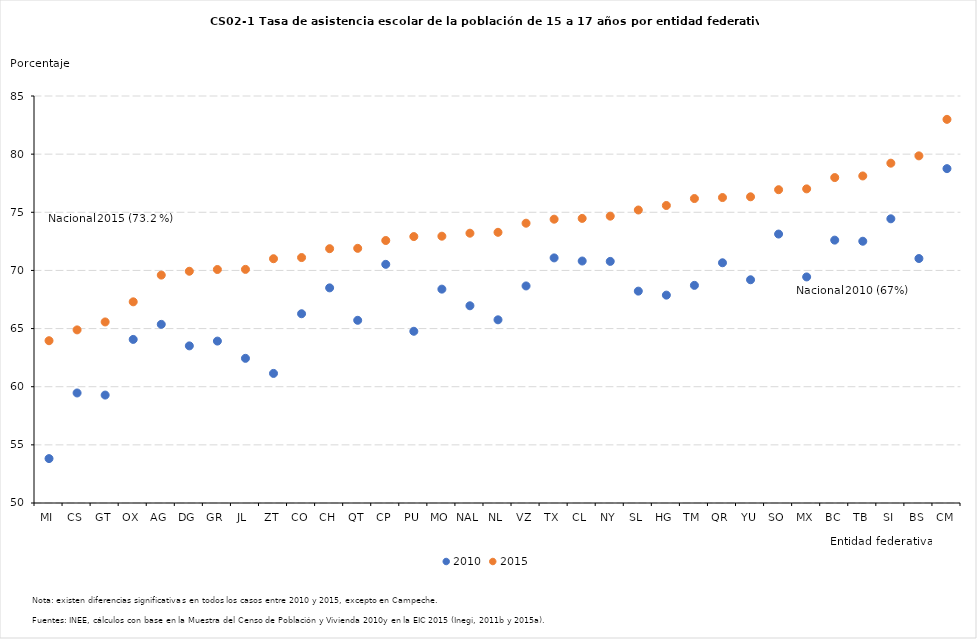
| Category | 2010 | 2015 | nal 2010 | nal 2015 |
|---|---|---|---|---|
| MI | 53.818 | 63.955 | 66.959 | 73.202 |
| CS | 59.462 | 64.887 | 66.959 | 73.202 |
| GT | 59.282 | 65.57 | 66.959 | 73.202 |
| OX | 64.068 | 67.3 | 66.959 | 73.202 |
| AG | 65.362 | 69.598 | 66.959 | 73.202 |
| DG | 63.512 | 69.928 | 66.959 | 73.202 |
| GR | 63.923 | 70.079 | 66.959 | 73.202 |
| JL | 62.44 | 70.09 | 66.959 | 73.202 |
| ZT | 61.144 | 71.007 | 66.959 | 73.202 |
| CO | 66.275 | 71.107 | 66.959 | 73.202 |
| CH | 68.5 | 71.87 | 66.959 | 73.202 |
| QT | 65.71 | 71.9 | 66.959 | 73.202 |
| CP | 70.524 | 72.573 | 66.959 | 73.202 |
| PU | 64.767 | 72.911 | 66.959 | 73.202 |
| MO | 68.391 | 72.944 | 66.959 | 73.202 |
| NAL | 66.959 | 73.202 | 66.959 | 73.202 |
| NL | 65.752 | 73.279 | 66.959 | 73.202 |
| VZ | 68.666 | 74.062 | 66.959 | 73.202 |
| TX | 71.078 | 74.406 | 66.959 | 73.202 |
| CL | 70.809 | 74.474 | 66.959 | 73.202 |
| NY | 70.777 | 74.667 | 66.959 | 73.202 |
| SL | 68.22 | 75.196 | 66.959 | 73.202 |
| HG | 67.876 | 75.584 | 66.959 | 73.202 |
| TM | 68.716 | 76.182 | 66.959 | 73.202 |
| QR | 70.66 | 76.268 | 66.959 | 73.202 |
| YU | 69.198 | 76.332 | 66.959 | 73.202 |
| SO | 73.127 | 76.943 | 66.959 | 73.202 |
| MX | 69.441 | 77.014 | 66.959 | 73.202 |
| BC | 72.605 | 77.986 | 66.959 | 73.202 |
| TB | 72.51 | 78.124 | 66.959 | 73.202 |
| SI | 74.439 | 79.223 | 66.959 | 73.202 |
| BS | 71.024 | 79.852 | 66.959 | 73.202 |
| CM | 78.753 | 82.992 | 66.959 | 73.202 |